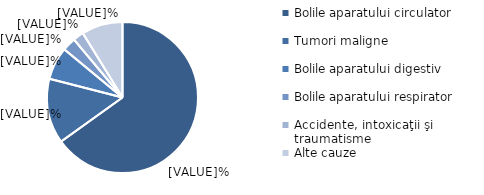
| Category | Femei |
|---|---|
| Bolile aparatului circulator | 65.1 |
| Tumori maligne | 13.9 |
| Bolile aparatului digestiv | 7 |
| Bolile aparatului respirator | 2.9 |
| Accidente, intoxicaţii şi traumatisme | 2.3 |
| Alte cauze  | 8.8 |